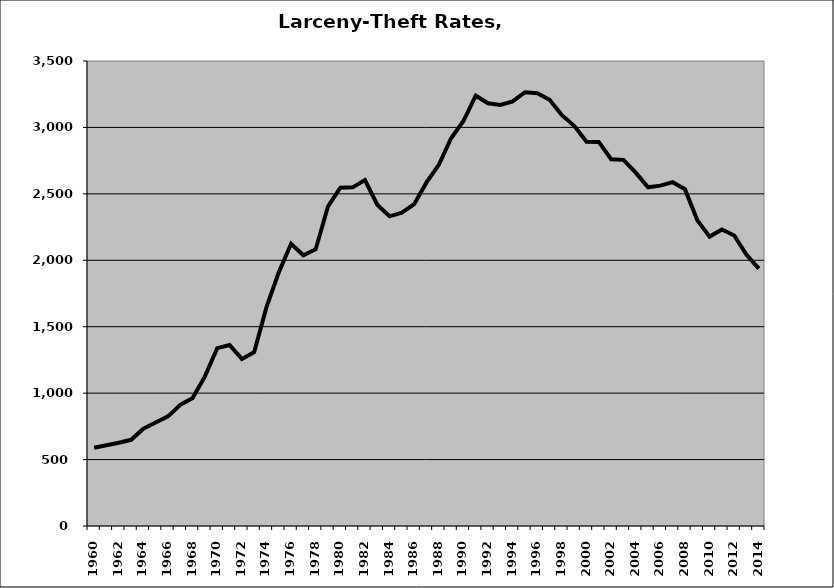
| Category | Larceny-Theft |
|---|---|
| 1960.0 | 589.642 |
| 1961.0 | 607.477 |
| 1962.0 | 626.548 |
| 1963.0 | 648.676 |
| 1964.0 | 732.77 |
| 1965.0 | 779.589 |
| 1966.0 | 825.16 |
| 1967.0 | 911.831 |
| 1968.0 | 962.843 |
| 1969.0 | 1126.11 |
| 1970.0 | 1338.867 |
| 1971.0 | 1362.398 |
| 1972.0 | 1257.652 |
| 1973.0 | 1308.25 |
| 1974.0 | 1647.138 |
| 1975.0 | 1909.173 |
| 1976.0 | 2124.045 |
| 1977.0 | 2037.846 |
| 1978.0 | 2083.432 |
| 1979.0 | 2406.404 |
| 1980.0 | 2546.416 |
| 1981.0 | 2548.799 |
| 1982.0 | 2603.439 |
| 1983.0 | 2418.086 |
| 1984.0 | 2330.9 |
| 1985.0 | 2358.593 |
| 1986.0 | 2422.65 |
| 1987.0 | 2586.013 |
| 1988.0 | 2718.756 |
| 1989.0 | 2918.627 |
| 1990.0 | 3048.274 |
| 1991.0 | 3238.712 |
| 1992.0 | 3181.602 |
| 1993.0 | 3168.769 |
| 1994.0 | 3195.714 |
| 1995.0 | 3264.92 |
| 1996.0 | 3257.012 |
| 1997.0 | 3208.458 |
| 1998.0 | 3092.036 |
| 1999.0 | 3012.278 |
| 2000.0 | 2891.762 |
| 2001.0 | 2891.031 |
| 2002.0 | 2760.799 |
| 2003.0 | 2755.917 |
| 2004.0 | 2659.655 |
| 2005.0 | 2549.346 |
| 2006.0 | 2561.981 |
| 2007.0 | 2588.016 |
| 2008.0 | 2535.11 |
| 2009.0 | 2301.734 |
| 2010.0 | 2178.379 |
| 2011.0 | 2232.418 |
| 2012.0 | 2186.531 |
| 2013.0 | 2041.27 |
| 2014.0 | 1937.799 |